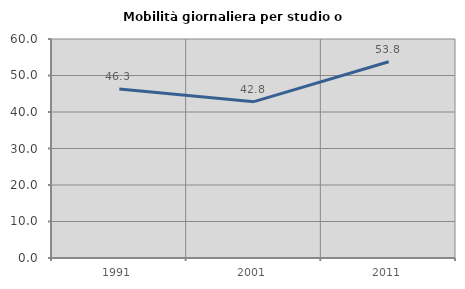
| Category | Mobilità giornaliera per studio o lavoro |
|---|---|
| 1991.0 | 46.289 |
| 2001.0 | 42.829 |
| 2011.0 | 53.767 |